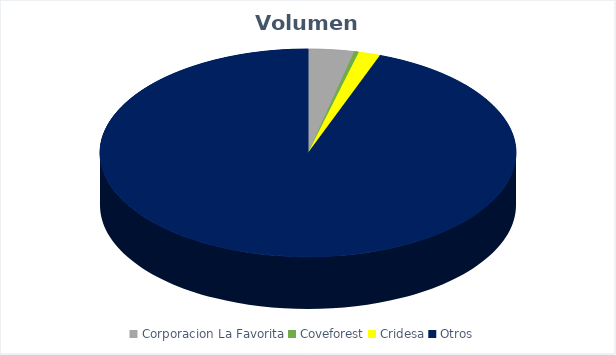
| Category | VOLUMEN ($USD) |
|---|---|
| Corporacion La Favorita | 12207.58 |
| Coveforest | 1201.2 |
| Cridesa | 5758.76 |
| Otros | 322707 |